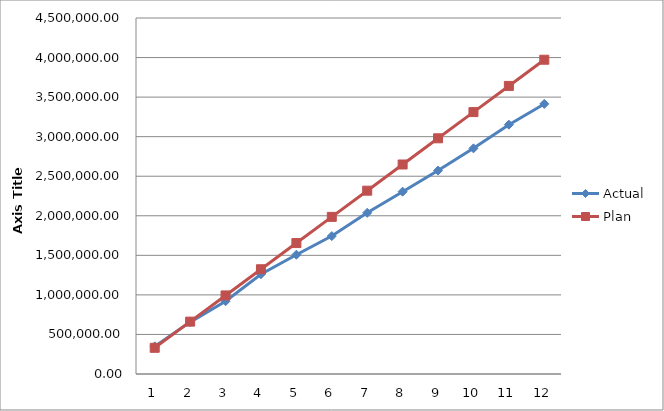
| Category | Actual | Plan |
|---|---|---|
| 0 | 349333.13 | 331041.667 |
| 1 | 656034.67 | 662083.333 |
| 2 | 919920.73 | 993125 |
| 3 | 1261373.58 | 1324166.667 |
| 4 | 1507930.31 | 1655208.333 |
| 5 | 1743364.54 | 1986250 |
| 6 | 2037503.34 | 2317291.667 |
| 7 | 2304716.46 | 2648333.333 |
| 8 | 2571183.37 | 2979375 |
| 9 | 2852307.52 | 3310416.667 |
| 10 | 3151494.42 | 3641458.333 |
| 11 | 3413929.95 | 3972500 |